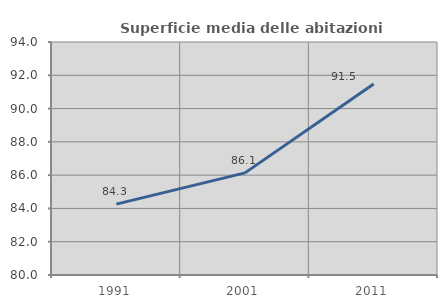
| Category | Superficie media delle abitazioni occupate |
|---|---|
| 1991.0 | 84.258 |
| 2001.0 | 86.136 |
| 2011.0 | 91.476 |